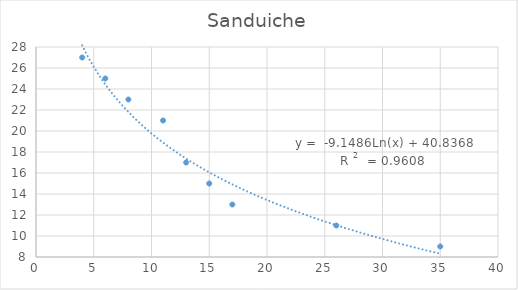
| Category | Sanduiche |
|---|---|
| 35.0 | 9 |
| 26.0 | 11 |
| 17.0 | 13 |
| 15.0 | 15 |
| 13.0 | 17 |
| 11.0 | 21 |
| 8.0 | 23 |
| 6.0 | 25 |
| 4.0 | 27 |